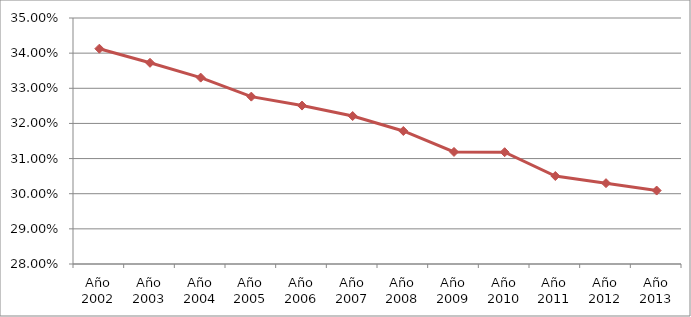
| Category | Series 0 |
|---|---|
| Año 2002 | 0.341 |
| Año 2003 | 0.337 |
| Año 2004 | 0.333 |
| Año 2005 | 0.328 |
| Año 2006 | 0.325 |
| Año 2007 | 0.322 |
| Año 2008 | 0.318 |
| Año 2009 | 0.312 |
| Año 2010 | 0.312 |
| Año 2011 | 0.305 |
| Año 2012 | 0.303 |
| Año 2013 | 0.301 |